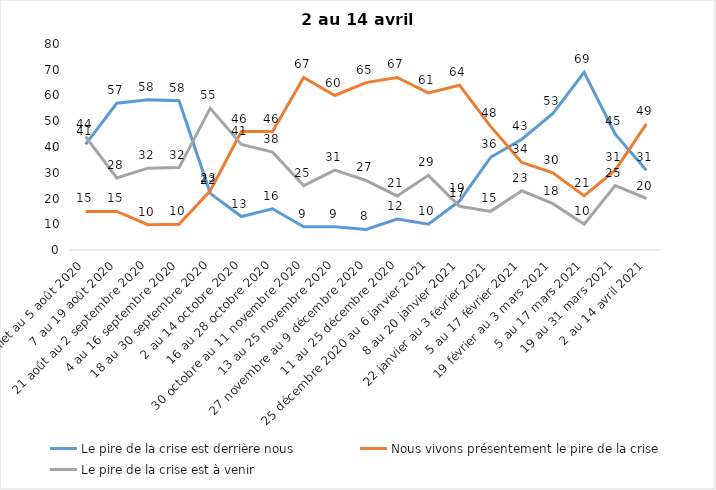
| Category | Le pire de la crise est derrière nous | Nous vivons présentement le pire de la crise | Le pire de la crise est à venir |
|---|---|---|---|
| 24 juillet au 5 août 2020 | 41 | 15 | 44 |
| 7 au 19 août 2020 | 57 | 15 | 28 |
| 21 août au 2 septembre 2020 | 58.39 | 9.84 | 31.77 |
| 4 au 16 septembre 2020 | 58 | 10 | 32 |
| 18 au 30 septembre 2020 | 22 | 23 | 55 |
| 2 au 14 octobre 2020 | 13 | 46 | 41 |
| 16 au 28 octobre 2020 | 16 | 46 | 38 |
| 30 octobre au 11 novembre 2020 | 9 | 67 | 25 |
| 13 au 25 novembre 2020 | 9 | 60 | 31 |
| 27 novembre au 9 décembre 2020 | 8 | 65 | 27 |
| 11 au 25 décembre 2020 | 12 | 67 | 21 |
| 25 décembre 2020 au 6 janvier 2021 | 10 | 61 | 29 |
| 8 au 20 janvier 2021 | 19 | 64 | 17 |
| 22 janvier au 3 février 2021 | 36 | 48 | 15 |
| 5 au 17 février 2021 | 43 | 34 | 23 |
| 19 février au 3 mars 2021 | 53 | 30 | 18 |
| 5 au 17 mars 2021 | 69 | 21 | 10 |
| 19 au 31 mars 2021 | 45 | 31 | 25 |
| 2 au 14 avril 2021 | 31 | 49 | 20 |